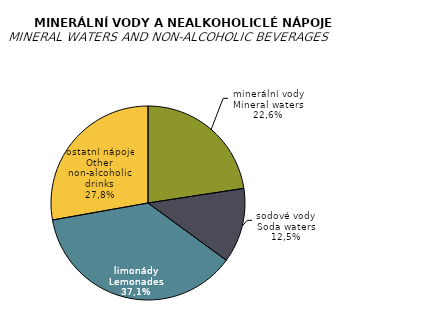
| Category | 2015 |
|---|---|
| minerální vody | 56.425 |
| sodové vody | 31.161 |
| limonády | 92.809 |
| ostatní nápoje | 69.469 |